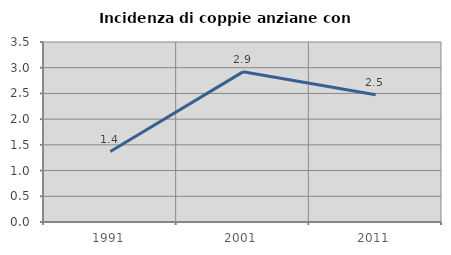
| Category | Incidenza di coppie anziane con figli |
|---|---|
| 1991.0 | 1.37 |
| 2001.0 | 2.92 |
| 2011.0 | 2.473 |